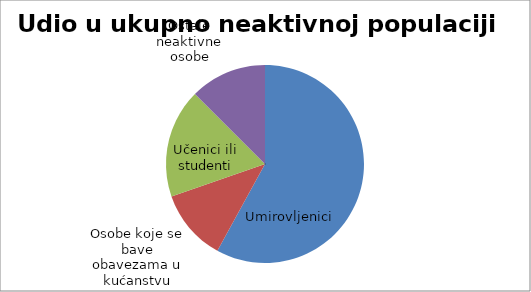
| Category | Series 0 |
|---|---|
| Umirovljenici | 0.58 |
| Osobe koje se bave obavezama u kućanstvu | 0.117 |
| Učenici ili studenti | 0.178 |
| Ostale neaktivne osobe | 0.125 |